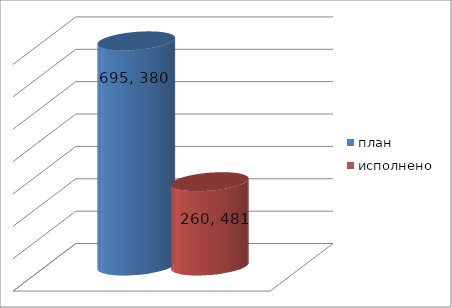
| Category | план | исполнено |
|---|---|---|
| 0 | 695380134.63 | 260481362.94 |